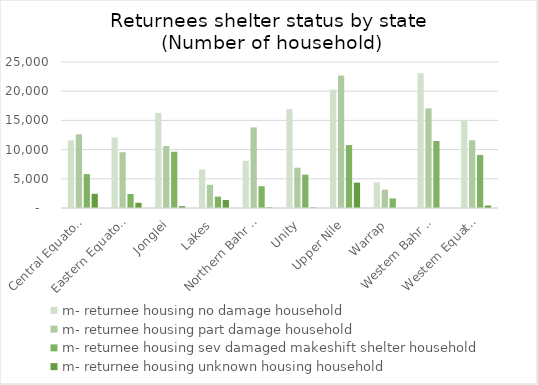
| Category | m- returnee housing no damage household | m- returnee housing part damage household | m- returnee housing sev damaged makeshift shelter household | m- returnee housing unknown housing household |
|---|---|---|---|---|
| Central Equatoria | 11590 | 12621 | 5798 | 2430 |
| Eastern Equatoria | 12042 | 9552 | 2399 | 894 |
| Jonglei | 16293 | 10613 | 9639 | 307 |
| Lakes | 6594 | 3973 | 1953 | 1367 |
| Northern Bahr el Ghazal | 8085 | 13801 | 3735 | 100 |
| Unity | 16935 | 6904 | 5711 | 86 |
| Upper Nile | 20269 | 22696 | 10777 | 4341 |
| Warrap | 4391 | 3147 | 1639 | 0 |
| Western Bahr el Ghazal | 23076 | 17051 | 11471 | 0 |
| Western Equatoria | 14933 | 11598 | 9078 | 413 |